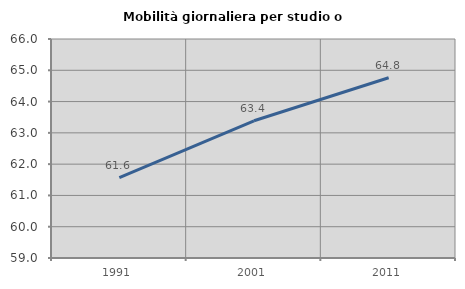
| Category | Mobilità giornaliera per studio o lavoro |
|---|---|
| 1991.0 | 61.571 |
| 2001.0 | 63.386 |
| 2011.0 | 64.761 |